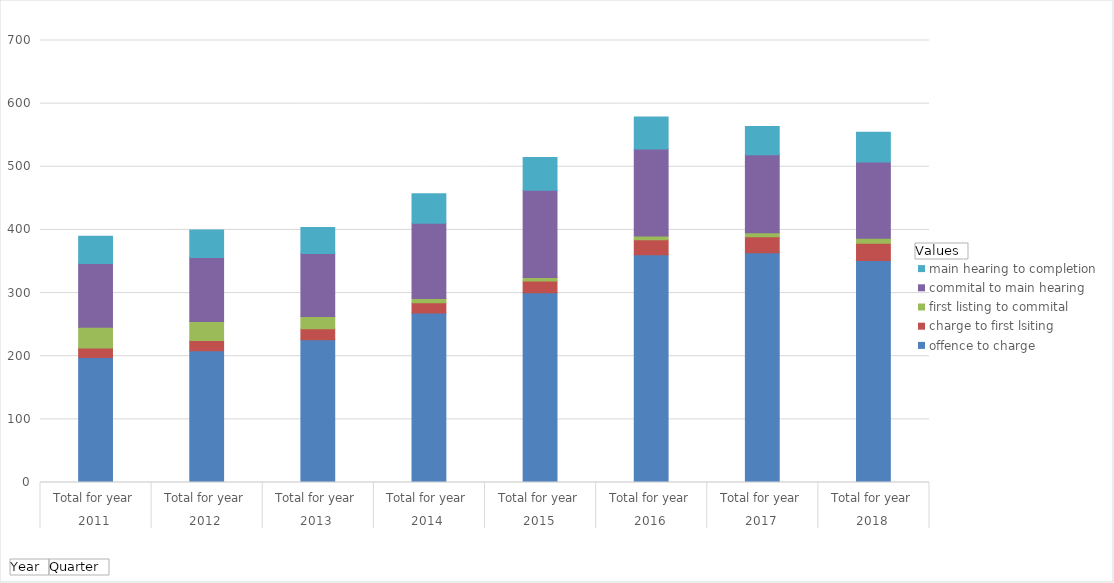
| Category | offence to charge | charge to first lsiting | first listing to commital | commital to main hearing | main hearing to completion |
|---|---|---|---|---|---|
| 0 | 198.118 | 15.03 | 32.856 | 100.642 | 43.2 |
| 1 | 208.675 | 16.116 | 30.018 | 101.628 | 43.52 |
| 2 | 226.092 | 17.481 | 19.448 | 99.683 | 40.968 |
| 3 | 268.259 | 16.603 | 6.454 | 119.081 | 46.827 |
| 4 | 300.602 | 18.569 | 5.492 | 137.989 | 52.064 |
| 5 | 360.605 | 24.009 | 5.615 | 137.757 | 50.794 |
| 6 | 364.046 | 25.05 | 6.582 | 123.548 | 44.466 |
| 7 | 351.728 | 27.08 | 7.883 | 121.019 | 47.075 |